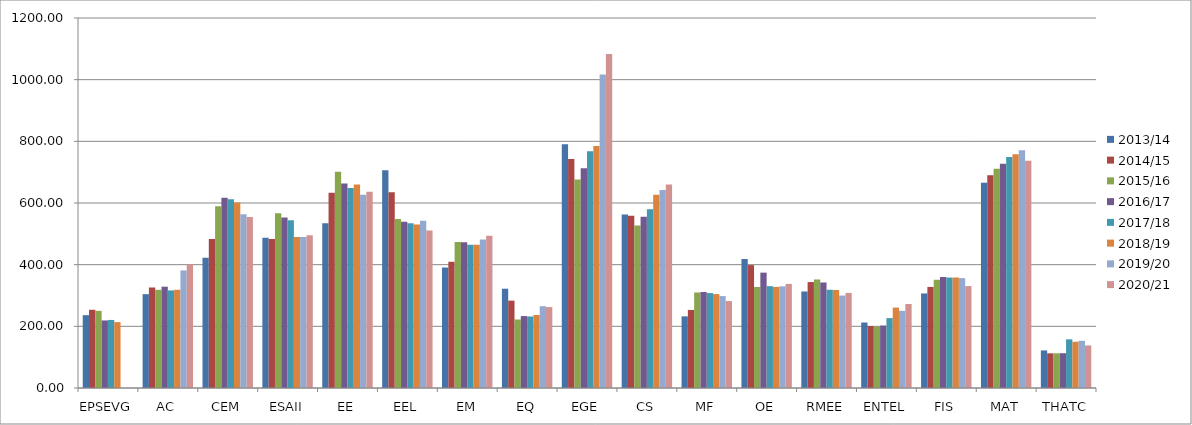
| Category | 2013/14 | 2014/15 | 2015/16 | 2016/17 | 2017/18 | 2018/19 | 2019/20 | 2020/21 |
|---|---|---|---|---|---|---|---|---|
| EPSEVG | 236.21 | 253.76 | 250.25 | 219.142 | 220.742 | 213.699 | 0 | 0 |
| AC | 304.33 | 326 | 318.5 | 328.58 | 316.55 | 318.61 | 381.28 | 401.19 |
| CEM | 422.78 | 483.14 | 589.525 | 617.17 | 612.267 | 601.49 | 563.118 | 554.67 |
| ESAII | 486.94 | 483.27 | 567 | 552.905 | 544.059 | 489.96 | 489.831 | 495.655 |
| EE | 534.44 | 633.19 | 701.6 | 663.57 | 648.45 | 660.34 | 626.371 | 636.196 |
| EEL | 705.89 | 634.64 | 548.15 | 538.866 | 534.172 | 529.952 | 542.478 | 510.825 |
| EM | 390.72 | 409.34 | 473.13 | 472.71 | 464.5 | 464.2 | 481.55 | 493.715 |
| EQ | 321.99 | 283.35 | 222.25 | 233.248 | 231.946 | 236.746 | 265.245 | 262.439 |
| EGE | 790.58 | 742.58 | 675.95 | 712.96 | 767.517 | 785.03 | 1016.44 | 1082.875 |
| CS | 562.37 | 559.01 | 526.91 | 555.16 | 579.6 | 626.94 | 641.92 | 659.83 |
| MF | 232.35 | 253.14 | 309.75 | 311.278 | 307.891 | 304.662 | 298.108 | 281.92 |
| OE | 418.04 | 398.58 | 327.765 | 374.17 | 330.3 | 327.85 | 329.7 | 337.555 |
| RMEE | 313.03 | 343.6 | 351.98 | 342.22 | 318.7 | 317.9 | 299.8 | 308.375 |
| ENTEL | 212.37 | 201.01 | 199 | 202.495 | 226.655 | 260.831 | 250.189 | 272.404 |
| FIS | 306.68 | 327.75 | 351 | 360 | 358.2 | 358.4 | 356.35 | 330.645 |
| MAT | 665.55 | 690 | 710.75 | 727.062 | 749.349 | 758.19 | 770.871 | 736.712 |
| THATC | 121.8 | 112.5 | 112.5 | 112.804 | 157.804 | 150 | 153 | 138 |